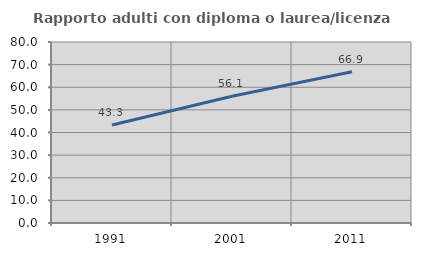
| Category | Rapporto adulti con diploma o laurea/licenza media  |
|---|---|
| 1991.0 | 43.287 |
| 2001.0 | 56.058 |
| 2011.0 | 66.886 |